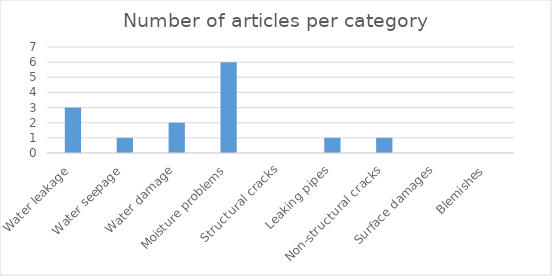
| Category | Number of articles per building defects |
|---|---|
| Water leakage | 3 |
| Water seepage | 1 |
| Water damage | 2 |
| Moisture problems | 6 |
| Structural cracks | 0 |
| Leaking pipes | 1 |
| Non-structural cracks | 1 |
| Surface damages | 0 |
| Blemishes | 0 |